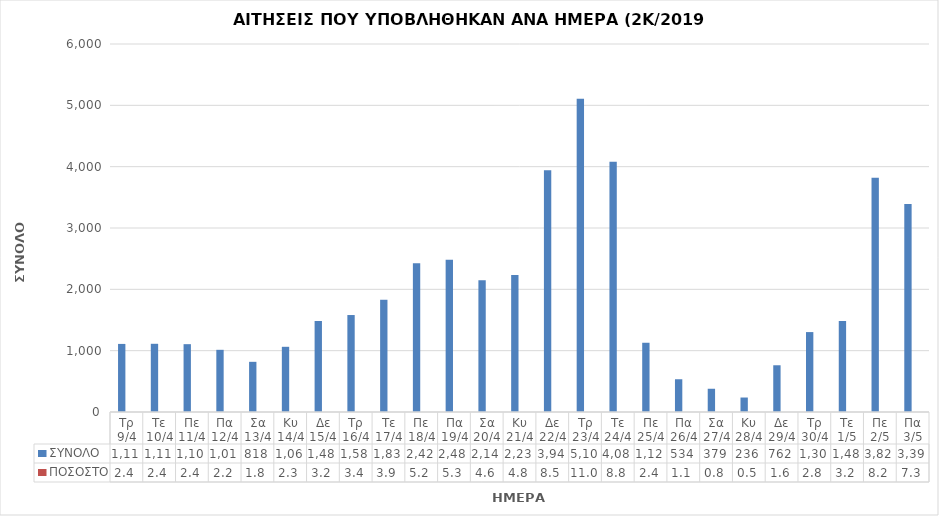
| Category | ΣΥΝΟΛΟ | ΠΟΣΟΣΤΟ |
|---|---|---|
| Τρ 9/4 | 1110 | 0.024 |
| Τε 10/4 | 1112 | 0.024 |
| Πε 11/4 | 1106 | 0.024 |
| Πα 12/4 | 1014 | 0.022 |
| Σα 13/4 | 818 | 0.018 |
| Κυ 14/4 | 1063 | 0.023 |
| Δε 15/4 | 1484 | 0.032 |
| Τρ 16/4 | 1581 | 0.034 |
| Τε 17/4 | 1830 | 0.039 |
| Πε 18/4 | 2424 | 0.052 |
| Πα 19/4 | 2482 | 0.053 |
| Σα 20/4 | 2148 | 0.046 |
| Κυ 21/4 | 2232 | 0.048 |
| Δε 22/4 | 3943 | 0.085 |
| Τρ 23/4 | 5108 | 0.11 |
| Τε 24/4 | 4081 | 0.088 |
| Πε 25/4 | 1129 | 0.024 |
| Πα 26/4 | 534 | 0.011 |
| Σα 27/4 | 379 | 0.008 |
| Κυ 28/4 | 236 | 0.005 |
| Δε 29/4 | 762 | 0.016 |
| Τρ 30/4 | 1303 | 0.028 |
| Τε 1/5 | 1485 | 0.032 |
| Πε 2/5 | 3821 | 0.082 |
| Πα 3/5 | 3391 | 0.073 |